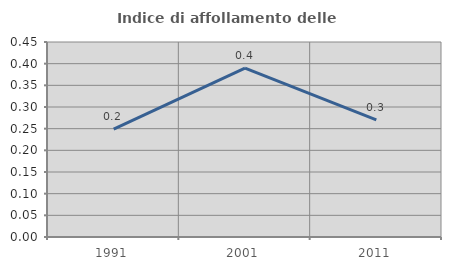
| Category | Indice di affollamento delle abitazioni  |
|---|---|
| 1991.0 | 0.249 |
| 2001.0 | 0.39 |
| 2011.0 | 0.27 |